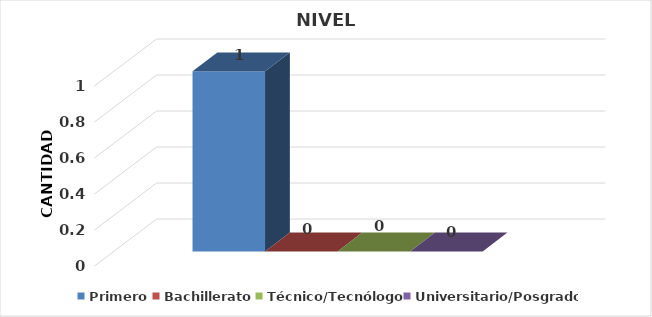
| Category | Primero | Bachillerato | Técnico/Tecnólogo | Universitario/Posgrado |
|---|---|---|---|---|
| 0 | 1 | 0 | 0 | 0 |